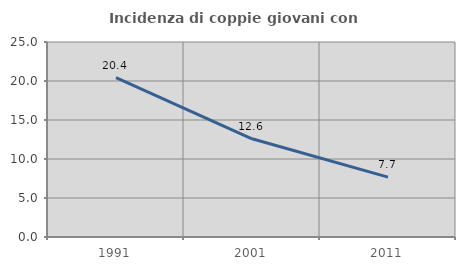
| Category | Incidenza di coppie giovani con figli |
|---|---|
| 1991.0 | 20.419 |
| 2001.0 | 12.594 |
| 2011.0 | 7.681 |